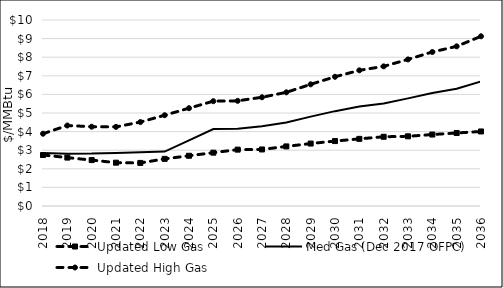
| Category | Updated Low Gas | Med Gas (Dec 2017 OFPC) | Updated High Gas |
|---|---|---|---|
| 2018.0 | 2.742 | 2.847 | 3.886 |
| 2019.0 | 2.603 | 2.814 | 4.328 |
| 2020.0 | 2.468 | 2.816 | 4.263 |
| 2021.0 | 2.329 | 2.852 | 4.254 |
| 2022.0 | 2.316 | 2.887 | 4.513 |
| 2023.0 | 2.534 | 2.927 | 4.881 |
| 2024.0 | 2.701 | 3.533 | 5.258 |
| 2025.0 | 2.867 | 4.138 | 5.636 |
| 2026.0 | 3.031 | 4.152 | 5.654 |
| 2027.0 | 3.04 | 4.291 | 5.846 |
| 2028.0 | 3.204 | 4.485 | 6.112 |
| 2029.0 | 3.357 | 4.804 | 6.541 |
| 2030.0 | 3.491 | 5.1 | 6.947 |
| 2031.0 | 3.609 | 5.355 | 7.294 |
| 2032.0 | 3.723 | 5.514 | 7.507 |
| 2033.0 | 3.747 | 5.785 | 7.881 |
| 2034.0 | 3.842 | 6.08 | 8.28 |
| 2035.0 | 3.925 | 6.301 | 8.584 |
| 2036.0 | 4.007 | 6.7 | 9.124 |